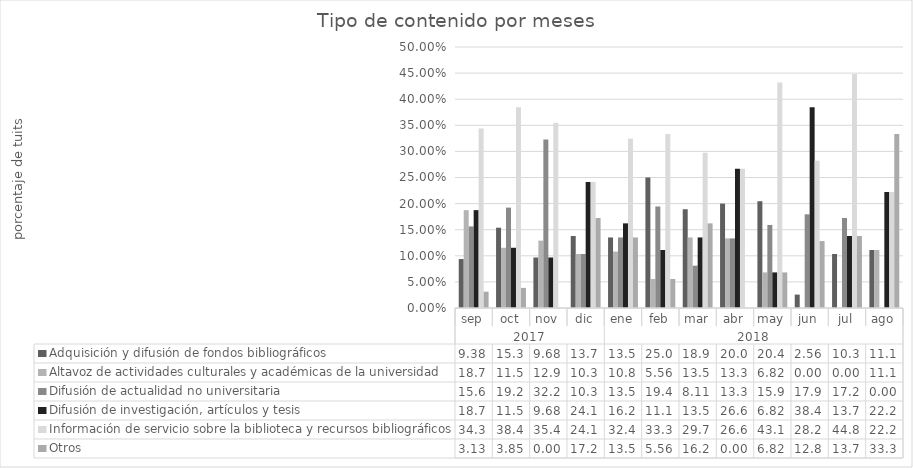
| Category | Adquisición y difusión de fondos bibliográficos | Altavoz de actividades culturales y académicas de la universidad | Difusión de actualidad no universitaria | Difusión de investigación, artículos y tesis | Información de servicio sobre la biblioteca y recursos bibliográficos | Otros |
|---|---|---|---|---|---|---|
| 0 | 0.094 | 0.188 | 0.156 | 0.188 | 0.344 | 0.031 |
| 1 | 0.154 | 0.115 | 0.192 | 0.115 | 0.385 | 0.038 |
| 2 | 0.097 | 0.129 | 0.323 | 0.097 | 0.355 | 0 |
| 3 | 0.138 | 0.103 | 0.103 | 0.241 | 0.241 | 0.172 |
| 4 | 0.135 | 0.108 | 0.135 | 0.162 | 0.324 | 0.135 |
| 5 | 0.25 | 0.056 | 0.194 | 0.111 | 0.333 | 0.056 |
| 6 | 0.189 | 0.135 | 0.081 | 0.135 | 0.297 | 0.162 |
| 7 | 0.2 | 0.133 | 0.133 | 0.267 | 0.267 | 0 |
| 8 | 0.205 | 0.068 | 0.159 | 0.068 | 0.432 | 0.068 |
| 9 | 0.026 | 0 | 0.179 | 0.385 | 0.282 | 0.128 |
| 10 | 0.103 | 0 | 0.172 | 0.138 | 0.448 | 0.138 |
| 11 | 0.111 | 0.111 | 0 | 0.222 | 0.222 | 0.333 |